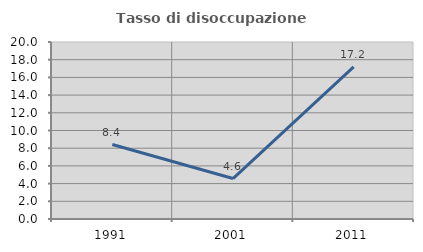
| Category | Tasso di disoccupazione giovanile  |
|---|---|
| 1991.0 | 8.415 |
| 2001.0 | 4.569 |
| 2011.0 | 17.197 |